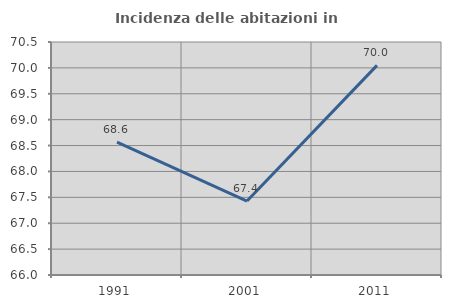
| Category | Incidenza delle abitazioni in proprietà  |
|---|---|
| 1991.0 | 68.564 |
| 2001.0 | 67.428 |
| 2011.0 | 70.048 |